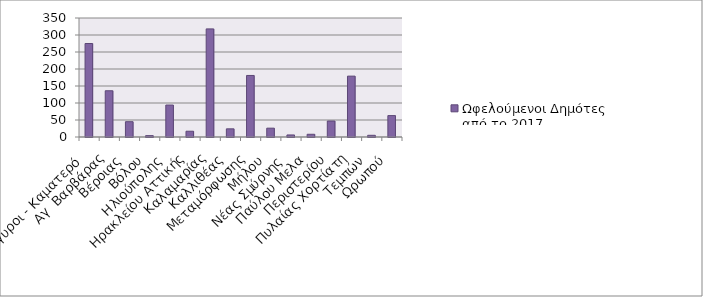
| Category | Ωφελούμενοι Δημότες από το 2017 |
|---|---|
| Αγ Αναργυροι - Καματερό  | 275 |
| Αγ  Βαρβάρας  | 136 |
| Βέροιας  | 45 |
| Βόλου  | 4 |
| Ηλιούπολης  | 94 |
| Ηρακλείου Αττικής | 17 |
| Καλαμαρίας  | 318 |
| Καλλιθέας  | 24 |
| Μεταμόρφωσης  | 181 |
| Μήλου  | 26 |
| Νέας Σμύρνης  | 6 |
| Παύλου Μελα  | 8 |
| Περιστερίου  | 47 |
| Πυλαίας Χορτίατη  | 179 |
| Τεμπών  | 5 |
| Ωρωπού  | 63 |